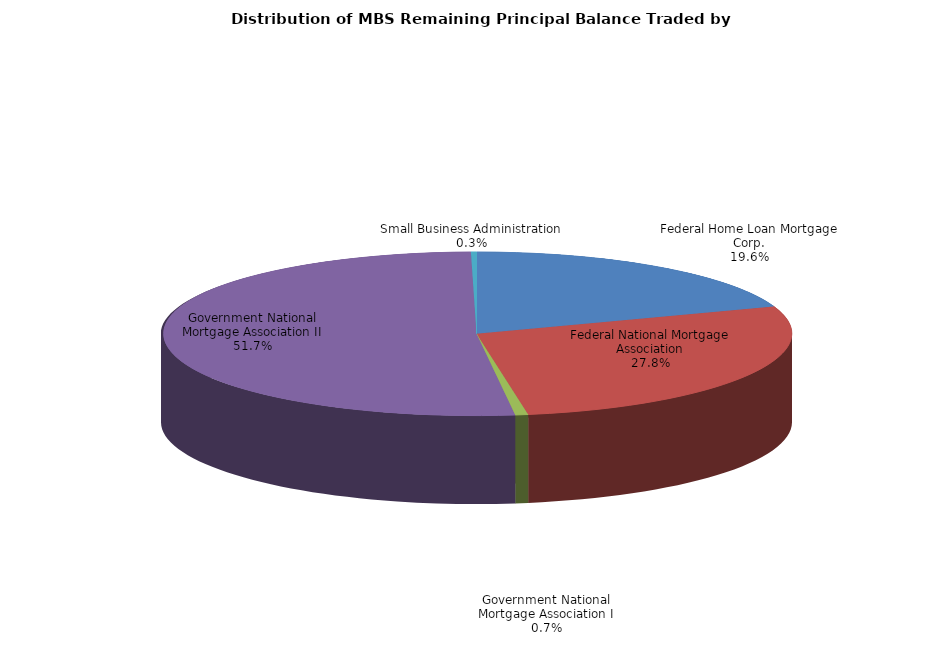
| Category | Series 0 |
|---|---|
| Federal Home Loan Mortgage Corp. | 2275257059.36 |
| Federal National Mortgage Association | 3234853170.849 |
| Government National Mortgage Association I | 76816398.602 |
| Government National Mortgage Association II | 6008802557.843 |
| Small Business Administration | 32930500.919 |